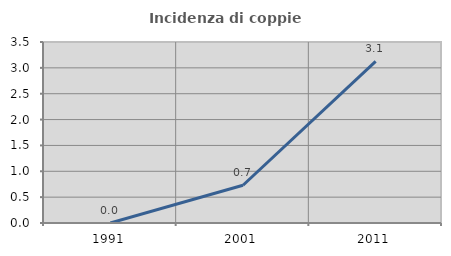
| Category | Incidenza di coppie miste |
|---|---|
| 1991.0 | 0 |
| 2001.0 | 0.73 |
| 2011.0 | 3.125 |